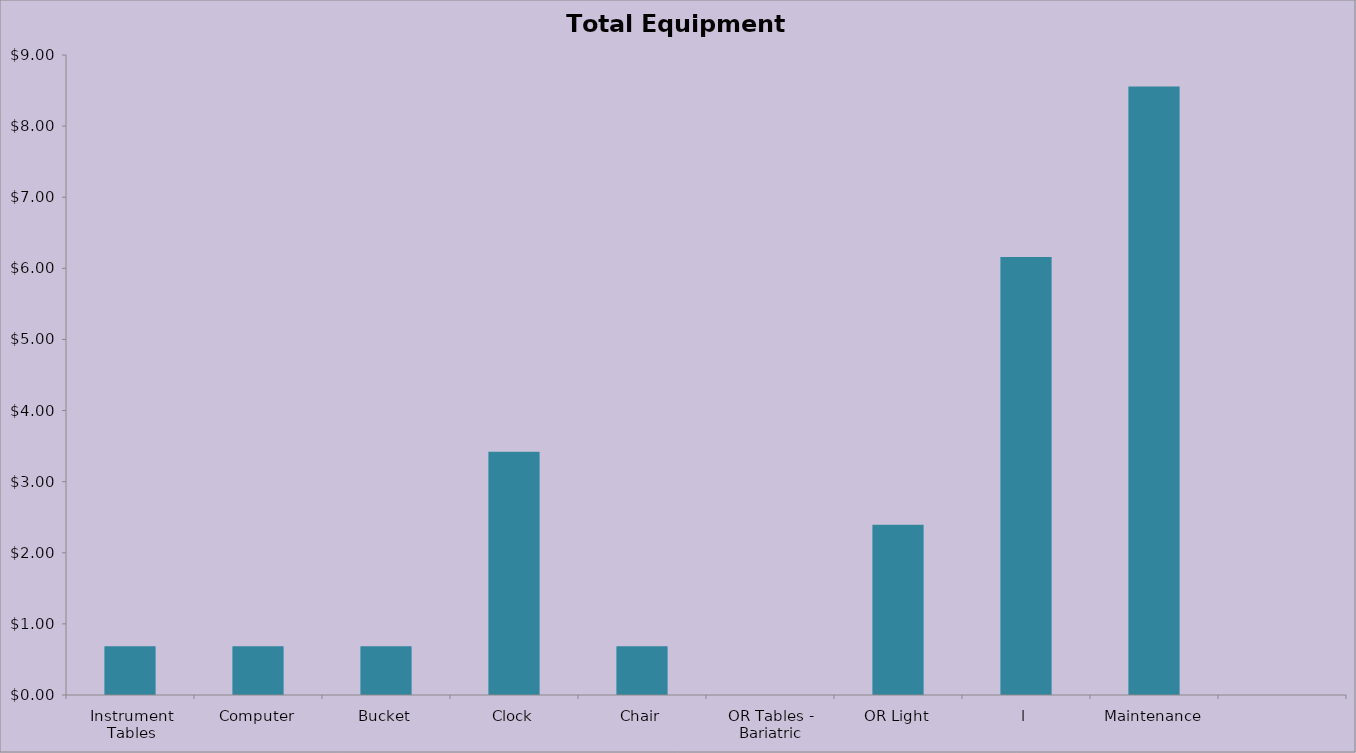
| Category | Total Equipment Cost |
|---|---|
| Instrument Tables | 0.684 |
| Computer | 0.684 |
| Bucket | 0.684 |
| Clock | 3.422 |
| Chair | 0.684 |
| OR Tables - Bariatric | 0 |
| OR Light | 2.396 |
| l | 6.16 |
| Maintenance | 8.556 |